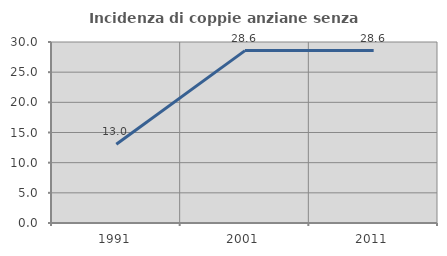
| Category | Incidenza di coppie anziane senza figli  |
|---|---|
| 1991.0 | 13.043 |
| 2001.0 | 28.571 |
| 2011.0 | 28.571 |